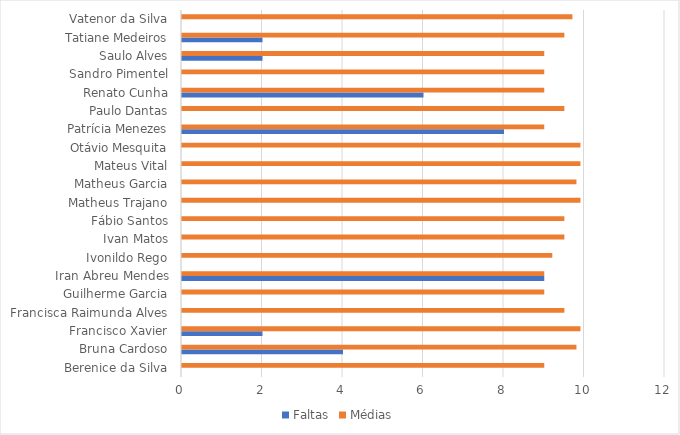
| Category | Faltas | Médias |
|---|---|---|
| Berenice da Silva | 0 | 9 |
| Bruna Cardoso | 4 | 9.8 |
| Francisco Xavier | 2 | 9.9 |
| Francisca Raimunda Alves | 0 | 9.5 |
| Guilherme Garcia | 0 | 9 |
| Iran Abreu Mendes | 9 | 9 |
| Ivonildo Rego | 0 | 9.2 |
| Ivan Matos | 0 | 9.5 |
| Fábio Santos | 0 | 9.5 |
| Matheus Trajano | 0 | 9.9 |
| Matheus Garcia | 0 | 9.8 |
| Mateus Vital | 0 | 9.9 |
| Otávio Mesquita | 0 | 9.9 |
| Patrícia Menezes | 8 | 9 |
| Paulo Dantas | 0 | 9.5 |
| Renato Cunha | 6 | 9 |
| Sandro Pimentel | 0 | 9 |
| Saulo Alves | 2 | 9 |
| Tatiane Medeiros | 2 | 9.5 |
| Vatenor da Silva | 0 | 9.7 |